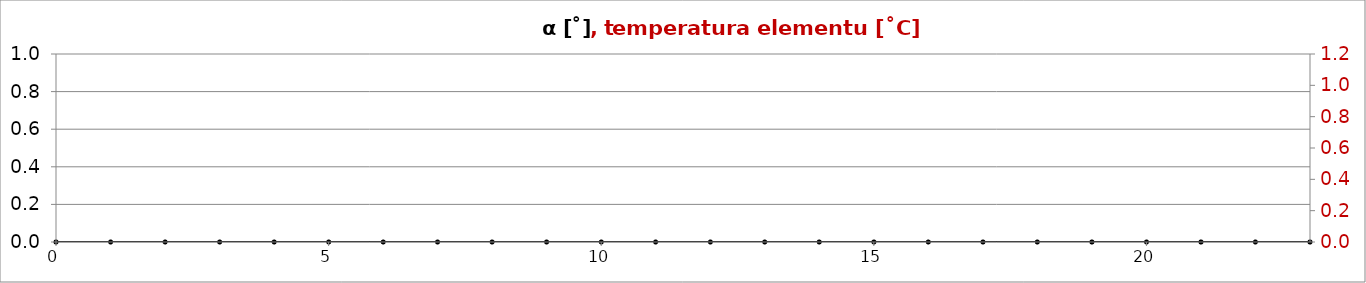
| Category | alfa |
|---|---|
| 0.0 | 0 |
| 1.0 | 0 |
| 2.0 | 0 |
| 3.0 | 0 |
| 4.0 | 0 |
| 5.0 | 0 |
| 6.0 | 0 |
| 7.0 | 0 |
| 8.0 | 0 |
| 9.0 | 0 |
| 10.0 | 0 |
| 11.0 | 0 |
| 12.0 | 0 |
| 13.0 | 0 |
| 14.0 | 0 |
| 15.0 | 0 |
| 16.0 | 0 |
| 17.0 | 0 |
| 18.0 | 0 |
| 19.0 | 0 |
| 20.0 | 0 |
| 21.0 | 0 |
| 22.0 | 0 |
| 23.0 | 0 |